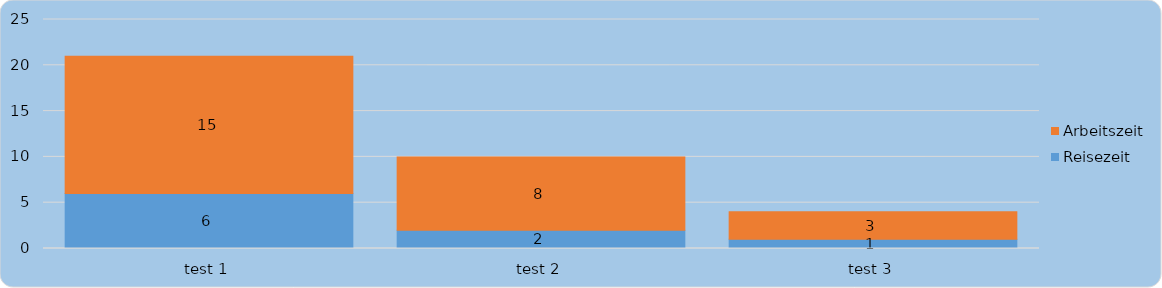
| Category | Reisezeit | Arbeitszeit |
|---|---|---|
| test 1 | 6 | 15 |
| test 2 | 2 | 8 |
| test 3 | 1 | 3 |